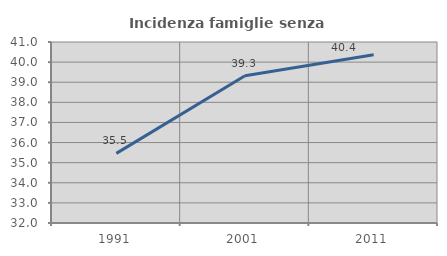
| Category | Incidenza famiglie senza nuclei |
|---|---|
| 1991.0 | 35.461 |
| 2001.0 | 39.326 |
| 2011.0 | 40.363 |